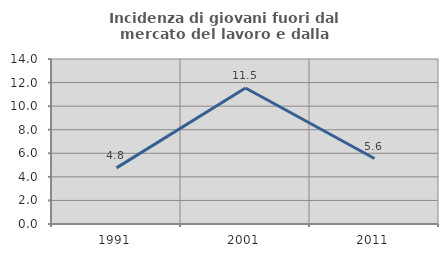
| Category | Incidenza di giovani fuori dal mercato del lavoro e dalla formazione  |
|---|---|
| 1991.0 | 4.762 |
| 2001.0 | 11.538 |
| 2011.0 | 5.556 |